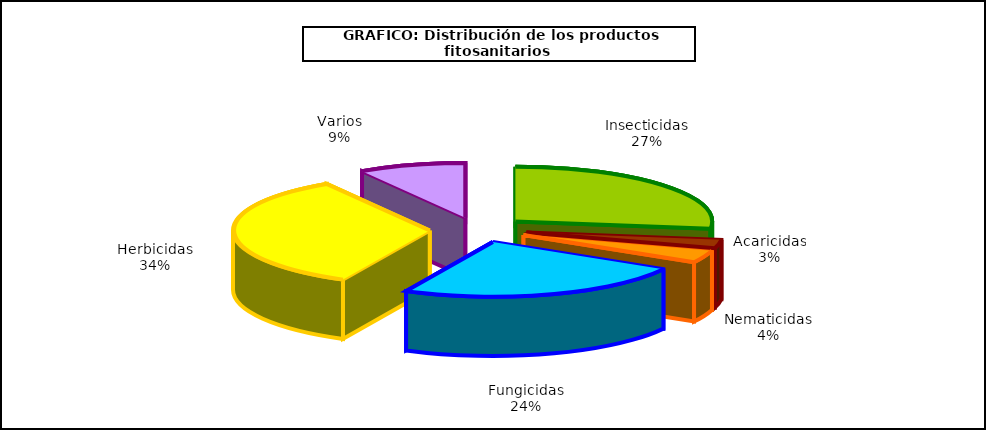
| Category | Insecticidas Acaricidas Nematicidas Fungicidas Herbicidas Varios |
|---|---|
| Insecticidas | 229.208 |
| Acaricidas | 21.377 |
| Nematicidas | 31.01 |
| Fungicidas | 202.541 |
| Herbicidas | 286.926 |
| Varios | 74.307 |